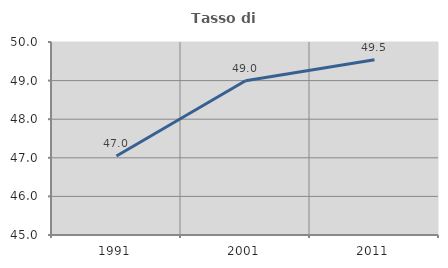
| Category | Tasso di occupazione   |
|---|---|
| 1991.0 | 47.048 |
| 2001.0 | 48.997 |
| 2011.0 | 49.537 |